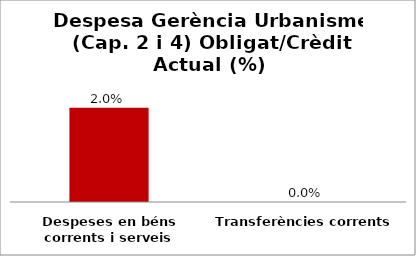
| Category | Series 0 |
|---|---|
| Despeses en béns corrents i serveis | 0.02 |
| Transferències corrents | 0 |